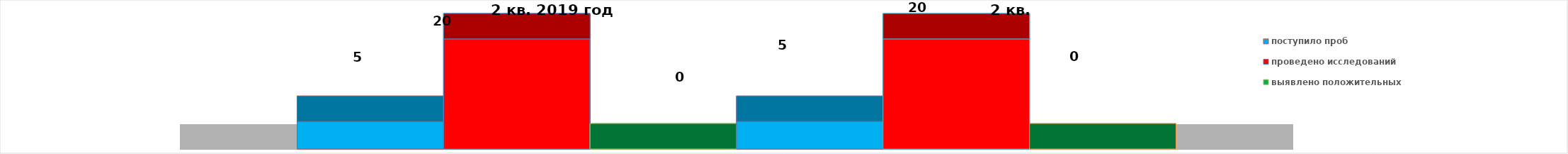
| Category | поступило проб | проведено исследований | выявлено положительных | 2 квартал 2020 год | 2016 год |
|---|---|---|---|---|---|
| 0 | 5 | 20 | 0 | 0 | 20 |